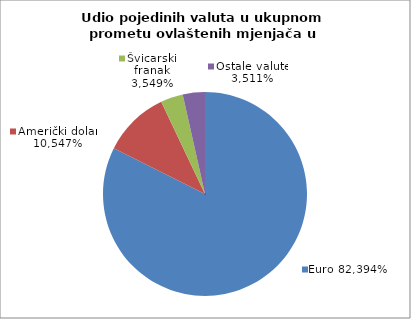
| Category | EUR |
|---|---|
| 0 | 0.824 |
| 1 | 0.105 |
| 2 | 0.035 |
| 3 | 0.035 |